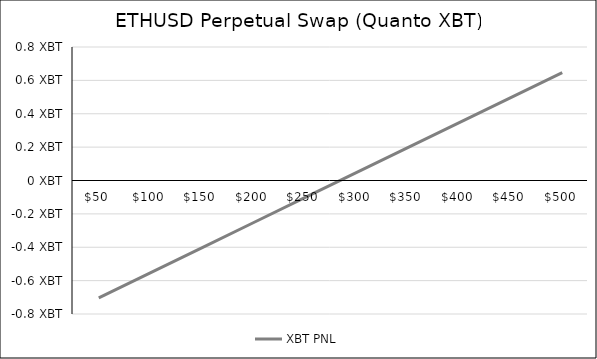
| Category | XBT PNL |
|---|---|
| 50.0 | -0.703 |
| 100.0 | -0.553 |
| 150.0 | -0.403 |
| 200.0 | -0.253 |
| 250.0 | -0.103 |
| 300.0 | 0.047 |
| 350.0 | 0.197 |
| 400.0 | 0.347 |
| 450.0 | 0.497 |
| 500.0 | 0.647 |